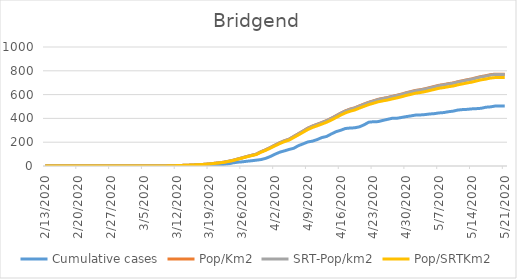
| Category | Cumulative cases | Pop/Km2 | SRT-Pop/km2 | Pop/SRTKm2 |
|---|---|---|---|---|
| 5/21/20 | 504 | 771.939 | 769.134 | 743.459 |
| 5/20/20 | 504 | 771.939 | 769.134 | 743.459 |
| 5/19/20 | 504 | 771.757 | 768.954 | 743.285 |
| 5/18/20 | 497 | 767.526 | 764.738 | 739.21 |
| 5/17/20 | 494 | 758.52 | 755.764 | 730.536 |
| 5/16/20 | 485 | 751.811 | 749.079 | 724.074 |
| 5/15/20 | 482 | 742.381 | 739.684 | 714.992 |
| 5/14/20 | 480 | 731.924 | 729.265 | 704.921 |
| 5/13/20 | 476 | 724.671 | 722.038 | 697.936 |
| 5/12/20 | 474 | 716.33 | 713.727 | 689.902 |
| 5/11/20 | 470 | 708.049 | 705.477 | 681.927 |
| 5/10/20 | 461 | 697.773 | 695.238 | 672.03 |
| 5/9/20 | 456 | 691.789 | 689.276 | 666.267 |
| 5/8/20 | 449 | 684.294 | 681.808 | 659.048 |
| 5/7/20 | 446 | 678.25 | 675.786 | 653.227 |
| 5/6/20 | 440 | 668.276 | 665.848 | 643.621 |
| 5/5/20 | 437 | 658.303 | 655.911 | 634.016 |
| 5/4/20 | 432 | 648.692 | 646.335 | 624.76 |
| 5/3/20 | 429 | 640.955 | 638.627 | 617.308 |
| 5/2/20 | 428 | 635.273 | 632.966 | 611.836 |
| 5/1/20 | 421 | 625.179 | 622.908 | 602.114 |
| 4/30/20 | 415 | 615.629 | 613.392 | 592.916 |
| 4/29/20 | 408 | 604.023 | 601.829 | 581.739 |
| 4/28/20 | 401 | 594.171 | 592.012 | 572.25 |
| 4/27/20 | 401 | 585.346 | 583.22 | 563.751 |
| 4/26/20 | 392 | 575.433 | 573.343 | 554.204 |
| 4/25/20 | 383 | 568.24 | 566.176 | 547.276 |
| 4/24/20 | 373 | 560.08 | 558.046 | 539.417 |
| 4/23/20 | 372 | 547.568 | 545.579 | 527.367 |
| 4/22/20 | 368 | 535.6 | 533.654 | 515.84 |
| 4/21/20 | 346 | 520.429 | 518.538 | 501.228 |
| 4/20/20 | 329 | 505.136 | 503.301 | 486.5 |
| 4/19/20 | 321 | 488.514 | 486.739 | 470.491 |
| 4/18/20 | 319 | 477.755 | 476.019 | 460.129 |
| 4/17/20 | 315 | 463.067 | 461.384 | 445.983 |
| 4/16/20 | 300 | 443.603 | 441.992 | 427.237 |
| 4/15/20 | 288 | 421.904 | 420.371 | 406.338 |
| 4/14/20 | 269 | 400.446 | 398.991 | 385.672 |
| 4/13/20 | 248 | 381.708 | 380.321 | 367.626 |
| 4/12/20 | 239 | 365.569 | 364.241 | 352.082 |
| 4/11/20 | 222 | 350.881 | 349.607 | 337.936 |
| 4/10/20 | 209 | 336.133 | 334.912 | 323.732 |
| 4/9/20 | 202 | 317.999 | 316.844 | 306.267 |
| 4/8/20 | 186 | 294.426 | 293.356 | 283.564 |
| 4/7/20 | 171 | 271.276 | 270.29 | 261.267 |
| 4/6/20 | 149 | 248.548 | 247.646 | 239.379 |
| 4/5/20 | 139 | 225.64 | 224.82 | 217.315 |
| 4/4/20 | 127 | 212.282 | 211.51 | 204.45 |
| 4/3/20 | 116 | 195.297 | 194.587 | 188.092 |
| 4/2/20 | 99 | 175.713 | 175.074 | 169.23 |
| 4/1/20 | 80 | 155.585 | 155.019 | 149.845 |
| 3/31/20 | 64 | 136.242 | 135.747 | 131.216 |
| 3/30/20 | 54 | 119.862 | 119.426 | 115.44 |
| 3/29/20 | 49 | 99.673 | 99.311 | 95.996 |
| 3/28/20 | 44 | 90.244 | 89.916 | 86.914 |
| 3/27/20 | 40 | 80.21 | 79.919 | 77.251 |
| 3/26/20 | 35 | 69.028 | 68.777 | 66.481 |
| 3/25/20 | 32 | 58.51 | 58.298 | 56.352 |
| 3/24/20 | 26 | 47.449 | 47.277 | 45.699 |
| 3/23/20 | 18 | 39.289 | 39.146 | 37.84 |
| 3/22/20 | 13 | 31.431 | 31.317 | 30.272 |
| 3/21/20 | 11 | 26.837 | 26.74 | 25.847 |
| 3/20/20 | 7 | 22.304 | 22.223 | 21.481 |
| 3/19/20 | 3 | 17.952 | 17.887 | 17.29 |
| 3/18/20 | 3 | 14.325 | 14.273 | 13.797 |
| 3/17/20 | 3 | 12.21 | 12.165 | 11.759 |
| 3/16/20 | 3 | 9.973 | 9.937 | 9.605 |
| 3/15/20 | 1 | 7.918 | 7.889 | 7.626 |
| 3/14/20 | 1 | 6.165 | 6.143 | 5.938 |
| 3/13/20 | 1 | 5.017 | 4.999 | 4.832 |
| 3/12/20 | 0 | 3.385 | 3.373 | 3.26 |
| 3/11/20 | 0 | 1.934 | 1.927 | 1.863 |
| 3/10/20 | 0 | 1.088 | 1.084 | 1.048 |
| 3/9/20 | 0 | 0.423 | 0.422 | 0.408 |
| 3/8/20 | 0 | 0.242 | 0.241 | 0.233 |
| 3/7/20 | 0 | 0.242 | 0.241 | 0.233 |
| 3/6/20 | 0 | 0.121 | 0.12 | 0.116 |
| 3/5/20 | 0 | 0.121 | 0.12 | 0.116 |
| 3/4/20 | 0 | 0.121 | 0.12 | 0.116 |
| 3/3/20 | 0 | 0.06 | 0.06 | 0.058 |
| 3/2/20 | 0 | 0.06 | 0.06 | 0.058 |
| 3/1/20 | 0 | 0.06 | 0.06 | 0.058 |
| 2/29/20 | 0 | 0.06 | 0.06 | 0.058 |
| 2/28/20 | 0 | 0.06 | 0.06 | 0.058 |
| 2/27/20 | 0 | 0.06 | 0.06 | 0.058 |
| 2/26/20 | 0 | 0 | 0 | 0 |
| 2/25/20 | 0 | 0 | 0 | 0 |
| 2/24/20 | 0 | 0 | 0 | 0 |
| 2/23/20 | 0 | 0 | 0 | 0 |
| 2/22/20 | 0 | 0 | 0 | 0 |
| 2/21/20 | 0 | 0 | 0 | 0 |
| 2/20/20 | 0 | 0 | 0 | 0 |
| 2/19/20 | 0 | 0 | 0 | 0 |
| 2/18/20 | 0 | 0 | 0 | 0 |
| 2/17/20 | 0 | 0 | 0 | 0 |
| 2/16/20 | 0 | 0 | 0 | 0 |
| 2/15/20 | 0 | 0 | 0 | 0 |
| 2/14/20 | 0 | 0 | 0 | 0 |
| 2/13/20 | 0 | 0 | 0 | 0 |